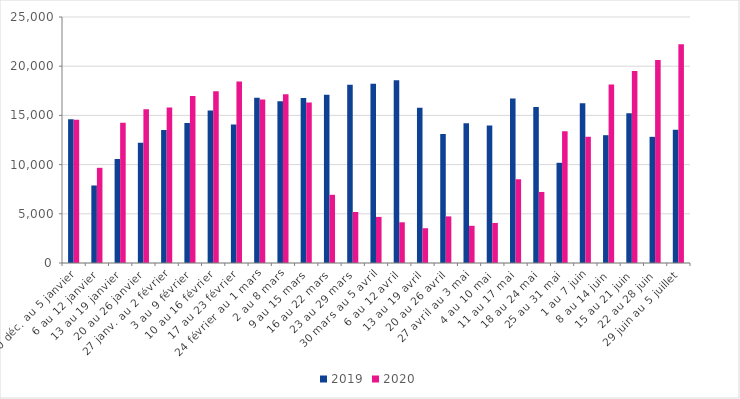
| Category | 2019 | 2020 |
|---|---|---|
| 30 déc. au 5 janvier | 14597 | 14553 |
| 6 au 12 janvier | 7879 | 9673 |
| 13 au 19 janvier | 10570 | 14241 |
| 20 au 26 janvier | 12222 | 15634 |
| 27 janv. au 2 février | 13510 | 15802 |
| 3 au 9 février | 14232 | 16975 |
| 10 au 16 février | 15499 | 17457 |
| 17 au 23 février | 14063 | 18441 |
| 24 février au 1 mars | 16783 | 16609 |
| 2 au 8 mars | 16432 | 17157.5 |
| 9 au 15 mars | 16765 | 16305.5 |
| 16 au 22 mars | 17107 | 6930 |
| 23 au 29 mars | 18126 | 5184 |
| 30 mars au 5 avril | 18204 | 4686 |
| 6 au 12 avril | 18560 | 4138 |
| 13 au 19 avril | 15788 | 3534 |
| 20 au 26 avril | 13099 | 4736 |
| 27 avril au 3 mai | 14207 | 3782 |
| 4 au 10 mai | 13969 | 4069 |
| 11 au 17 mai | 16713 | 8510 |
| 18 au 24 mai | 15841 | 7220 |
| 25 au 31 mai | 10184 | 13383 |
| 1 au 7 juin | 16246 | 12828 |
| 8 au 14 juin | 12988 | 18137 |
| 15 au 21 juin | 15214 | 19517 |
| 22 au 28 juin | 12823 | 20637 |
| 29 juin au 5 juillet | 13531 | 22243 |